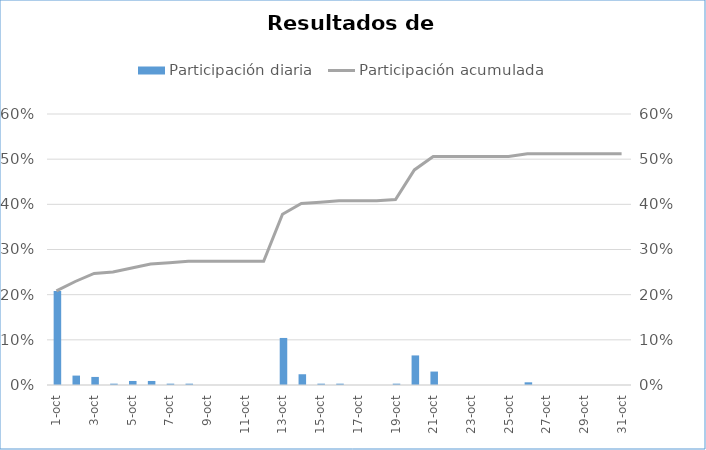
| Category | Participación diaria |
|---|---|
| 2020-10-01 | 0.208 |
| 2020-10-02 | 0.021 |
| 2020-10-03 | 0.018 |
| 2020-10-04 | 0.003 |
| 2020-10-05 | 0.009 |
| 2020-10-06 | 0.009 |
| 2020-10-07 | 0.003 |
| 2020-10-08 | 0.003 |
| 2020-10-09 | 0 |
| 2020-10-10 | 0 |
| 2020-10-11 | 0 |
| 2020-10-12 | 0 |
| 2020-10-13 | 0.104 |
| 2020-10-14 | 0.024 |
| 2020-10-15 | 0.003 |
| 2020-10-16 | 0.003 |
| 2020-10-17 | 0 |
| 2020-10-18 | 0 |
| 2020-10-19 | 0.003 |
| 2020-10-20 | 0.065 |
| 2020-10-21 | 0.03 |
| 2020-10-22 | 0 |
| 2020-10-23 | 0 |
| 2020-10-24 | 0 |
| 2020-10-25 | 0 |
| 2020-10-26 | 0.006 |
| 2020-10-27 | 0 |
| 2020-10-28 | 0 |
| 2020-10-29 | 0 |
| 2020-10-30 | 0 |
| 2020-10-31 | 0 |